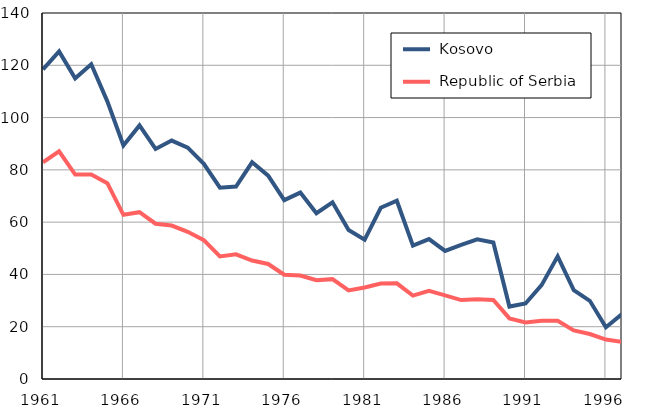
| Category |  Kosovo |  Republic of Serbia |
|---|---|---|
| 1961.0 | 118.4 | 82.9 |
| 1962.0 | 125.3 | 87.1 |
| 1963.0 | 115 | 78.2 |
| 1964.0 | 120.4 | 78.2 |
| 1965.0 | 106.2 | 74.9 |
| 1966.0 | 89.3 | 62.8 |
| 1967.0 | 97 | 63.8 |
| 1968.0 | 88 | 59.4 |
| 1969.0 | 91.2 | 58.7 |
| 1970.0 | 88.5 | 56.3 |
| 1971.0 | 82.3 | 53.1 |
| 1972.0 | 73.2 | 46.9 |
| 1973.0 | 73.6 | 47.7 |
| 1974.0 | 82.9 | 45.3 |
| 1975.0 | 77.8 | 44 |
| 1976.0 | 68.4 | 39.9 |
| 1977.0 | 71.3 | 39.6 |
| 1978.0 | 63.4 | 37.8 |
| 1979.0 | 67.6 | 38.2 |
| 1980.0 | 57 | 33.9 |
| 1981.0 | 53.3 | 35 |
| 1982.0 | 65.5 | 36.5 |
| 1983.0 | 68.2 | 36.6 |
| 1984.0 | 51 | 31.9 |
| 1985.0 | 53.5 | 33.7 |
| 1986.0 | 49 | 32 |
| 1987.0 | 51.3 | 30.2 |
| 1988.0 | 53.4 | 30.5 |
| 1989.0 | 52.2 | 30.2 |
| 1990.0 | 27.7 | 23.2 |
| 1991.0 | 28.9 | 21.6 |
| 1992.0 | 35.9 | 22.3 |
| 1993.0 | 46.9 | 22.3 |
| 1994.0 | 34 | 18.6 |
| 1995.0 | 29.9 | 17.2 |
| 1996.0 | 19.8 | 15.1 |
| 1997.0 | 24.8 | 14.2 |